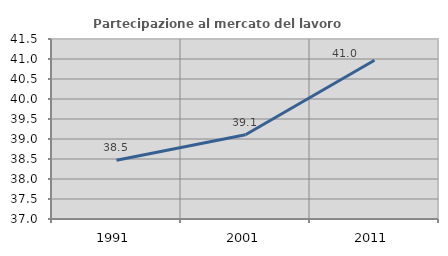
| Category | Partecipazione al mercato del lavoro  femminile |
|---|---|
| 1991.0 | 38.469 |
| 2001.0 | 39.108 |
| 2011.0 | 40.968 |